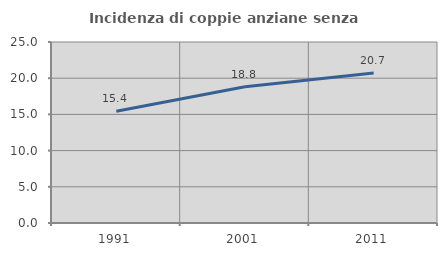
| Category | Incidenza di coppie anziane senza figli  |
|---|---|
| 1991.0 | 15.443 |
| 2001.0 | 18.812 |
| 2011.0 | 20.725 |